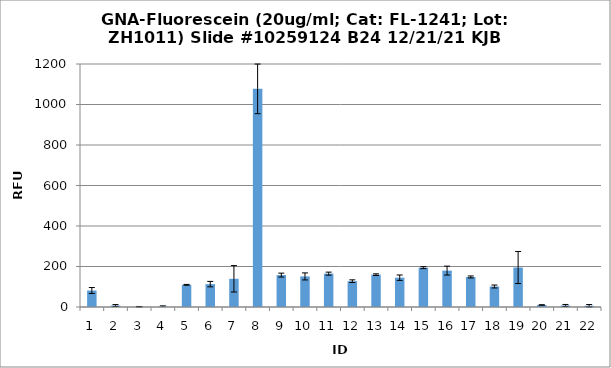
| Category | Series 0 |
|---|---|
| 0 | 81.5 |
| 1 | 7.25 |
| 2 | 1.5 |
| 3 | 2.75 |
| 4 | 109.5 |
| 5 | 113 |
| 6 | 139.25 |
| 7 | 1077.25 |
| 8 | 157.5 |
| 9 | 151 |
| 10 | 164.75 |
| 11 | 127.5 |
| 12 | 159.75 |
| 13 | 144.75 |
| 14 | 194.25 |
| 15 | 179.75 |
| 16 | 148.25 |
| 17 | 101.25 |
| 18 | 195 |
| 19 | 10 |
| 20 | 7.5 |
| 21 | 6.25 |